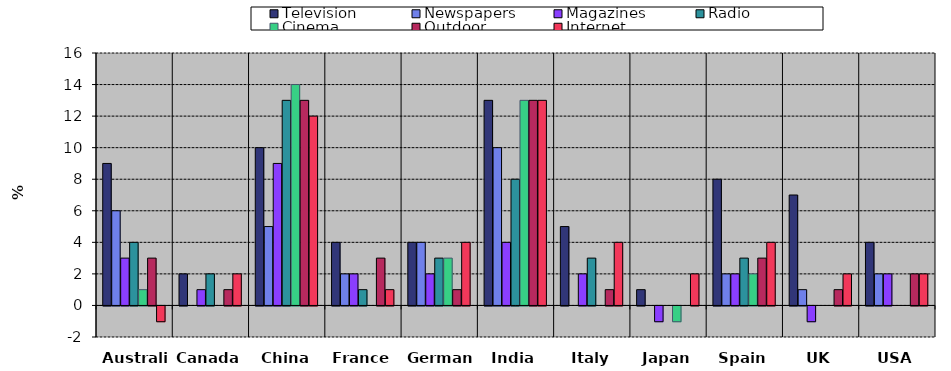
| Category | Television | Newspapers | Magazines | Radio | Cinema | Outdoor | Internet |
|---|---|---|---|---|---|---|---|
| Australia | 9 | 6 | 3 | 4 | 1 | 3 | -1 |
| Canada | 2 | 0 | 1 | 2 | 0 | 1 | 2 |
| China | 10 | 5 | 9 | 13 | 14 | 13 | 12 |
| France | 4 | 2 | 2 | 1 | 0 | 3 | 1 |
| Germany | 4 | 4 | 2 | 3 | 3 | 1 | 4 |
| India | 13 | 10 | 4 | 8 | 13 | 13 | 13 |
| Italy | 5 | 0 | 2 | 3 | 0 | 1 | 4 |
| Japan | 1 | 0 | -1 | 0 | -1 | 0 | 2 |
| Spain | 8 | 2 | 2 | 3 | 2 | 3 | 4 |
| UK | 7 | 1 | -1 | 0 | 0 | 1 | 2 |
| USA | 4 | 2 | 2 | 0 | 0 | 2 | 2 |